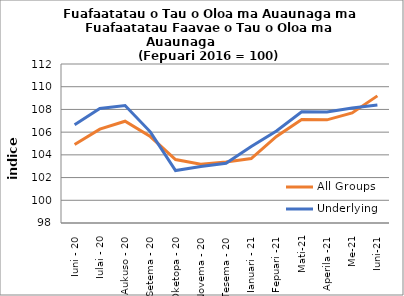
| Category | All Groups | Underlying |
|---|---|---|
| Iuni - 20 | 104.913 | 106.661 |
| Iulai - 20 | 106.265 | 108.077 |
| Aukuso - 20 | 106.963 | 108.349 |
| Setema - 20 | 105.614 | 106.027 |
| Oketopa - 20 | 103.588 | 102.619 |
| Novema - 20 | 103.171 | 102.969 |
| Tesema - 20 | 103.378 | 103.266 |
| Ianuari - 21 | 103.671 | 104.733 |
| Fepuari -21 | 105.627 | 106.099 |
| Mati-21 | 107.11 | 107.788 |
| Aperila -21 | 107.082 | 107.772 |
| Me-21 | 107.693 | 108.128 |
| Iuni-21 | 109.193 | 108.399 |